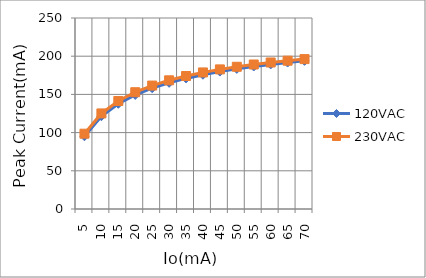
| Category | 120VAC | 230VAC |
|---|---|---|
| 5.0 | 95.24 | 98.567 |
| 10.0 | 121.448 | 125.086 |
| 15.0 | 137.717 | 141.367 |
| 20.0 | 149.299 | 152.86 |
| 25.0 | 158.131 | 161.563 |
| 30.0 | 165.159 | 168.449 |
| 35.0 | 170.921 | 174.066 |
| 40.0 | 175.749 | 178.752 |
| 45.0 | 179.865 | 182.732 |
| 50.0 | 183.423 | 186.16 |
| 55.0 | 186.533 | 189.147 |
| 60.0 | 189.278 | 191.776 |
| 65.0 | 191.721 | 194.109 |
| 70.0 | 193.91 | 196.195 |